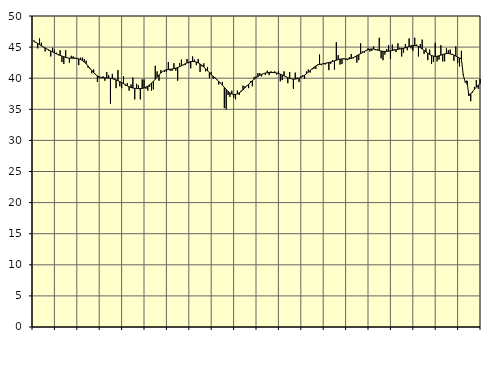
| Category | Piggar | Series 1 |
|---|---|---|
| nan | 46.1 | 45.91 |
| 1.0 | 45.8 | 45.76 |
| 1.0 | 44.8 | 45.59 |
| 1.0 | 46.4 | 45.4 |
| 1.0 | 45.7 | 45.22 |
| 1.0 | 45 | 45.03 |
| 1.0 | 44.3 | 44.86 |
| 1.0 | 44.7 | 44.69 |
| 1.0 | 44.4 | 44.53 |
| 1.0 | 43.5 | 44.37 |
| 1.0 | 44.9 | 44.22 |
| 1.0 | 44.6 | 44.07 |
| nan | 44.1 | 43.93 |
| 2.0 | 43.7 | 43.8 |
| 2.0 | 44.5 | 43.67 |
| 2.0 | 42.6 | 43.56 |
| 2.0 | 42.3 | 43.45 |
| 2.0 | 44.5 | 43.35 |
| 2.0 | 43.3 | 43.27 |
| 2.0 | 42.5 | 43.23 |
| 2.0 | 43.6 | 43.21 |
| 2.0 | 43.5 | 43.21 |
| 2.0 | 43.3 | 43.21 |
| 2.0 | 43.1 | 43.18 |
| nan | 42.1 | 43.11 |
| 3.0 | 43.3 | 43 |
| 3.0 | 43.3 | 42.83 |
| 3.0 | 43.1 | 42.59 |
| 3.0 | 42.8 | 42.31 |
| 3.0 | 41.7 | 41.97 |
| 3.0 | 41.5 | 41.6 |
| 3.0 | 40.8 | 41.24 |
| 3.0 | 41.4 | 40.9 |
| 3.0 | 40.7 | 40.6 |
| 3.0 | 39.4 | 40.37 |
| 3.0 | 40 | 40.21 |
| nan | 40 | 40.11 |
| 4.0 | 40.3 | 40.07 |
| 4.0 | 39.6 | 40.05 |
| 4.0 | 41 | 40.04 |
| 4.0 | 40.5 | 40.02 |
| 4.0 | 35.9 | 39.98 |
| 4.0 | 40.7 | 39.92 |
| 4.0 | 40 | 39.84 |
| 4.0 | 38.4 | 39.73 |
| 4.0 | 41.3 | 39.6 |
| 4.0 | 38.7 | 39.46 |
| 4.0 | 38.4 | 39.3 |
| nan | 40.3 | 39.13 |
| 5.0 | 38.8 | 38.95 |
| 5.0 | 39.2 | 38.77 |
| 5.0 | 38 | 38.62 |
| 5.0 | 39 | 38.5 |
| 5.0 | 40.1 | 38.42 |
| 5.0 | 36.6 | 38.37 |
| 5.0 | 39.1 | 38.34 |
| 5.0 | 38.9 | 38.32 |
| 5.0 | 36.6 | 38.33 |
| 5.0 | 39.8 | 38.36 |
| 5.0 | 39.8 | 38.44 |
| nan | 38.3 | 38.57 |
| 6.0 | 38 | 38.73 |
| 6.0 | 38.6 | 38.94 |
| 6.0 | 38 | 39.2 |
| 6.0 | 38.2 | 39.5 |
| 6.0 | 42 | 39.82 |
| 6.0 | 41.1 | 40.18 |
| 6.0 | 39.6 | 40.53 |
| 6.0 | 41.3 | 40.84 |
| 6.0 | 41.1 | 41.09 |
| 6.0 | 41 | 41.27 |
| 6.0 | 41 | 41.37 |
| nan | 42.6 | 41.41 |
| 7.0 | 41.2 | 41.44 |
| 7.0 | 41.2 | 41.48 |
| 7.0 | 42.4 | 41.54 |
| 7.0 | 41.2 | 41.62 |
| 7.0 | 39.6 | 41.73 |
| 7.0 | 42.4 | 41.85 |
| 7.0 | 43 | 41.99 |
| 7.0 | 42.1 | 42.15 |
| 7.0 | 42.1 | 42.31 |
| 7.0 | 43.1 | 42.46 |
| 7.0 | 42.4 | 42.59 |
| nan | 41.6 | 42.67 |
| 8.0 | 43.5 | 42.69 |
| 8.0 | 43 | 42.67 |
| 8.0 | 42.1 | 42.59 |
| 8.0 | 43.1 | 42.46 |
| 8.0 | 41 | 42.28 |
| 8.0 | 41.9 | 42.07 |
| 8.0 | 42.4 | 41.8 |
| 8.0 | 41.1 | 41.5 |
| 8.0 | 41.8 | 41.19 |
| 8.0 | 40 | 40.89 |
| 8.0 | 41 | 40.59 |
| nan | 39.9 | 40.31 |
| 9.0 | 40.1 | 40.04 |
| 9.0 | 39.7 | 39.77 |
| 9.0 | 39 | 39.49 |
| 9.0 | 39.3 | 39.19 |
| 9.0 | 39.4 | 38.86 |
| 9.0 | 35.2 | 38.53 |
| 9.0 | 35 | 38.19 |
| 9.0 | 37.3 | 37.88 |
| 9.0 | 37 | 37.63 |
| 9.0 | 38 | 37.46 |
| 9.0 | 36.8 | 37.37 |
| nan | 36.6 | 37.38 |
| 10.0 | 38 | 37.48 |
| 10.0 | 37.3 | 37.64 |
| 10.0 | 38 | 37.87 |
| 10.0 | 38.8 | 38.14 |
| 10.0 | 38.7 | 38.43 |
| 10.0 | 38.8 | 38.73 |
| 10.0 | 38.4 | 39.03 |
| 10.0 | 39.5 | 39.32 |
| 10.0 | 38.7 | 39.59 |
| 10.0 | 40.2 | 39.85 |
| 10.0 | 40.3 | 40.08 |
| nan | 40.8 | 40.29 |
| 11.0 | 40.8 | 40.47 |
| 11.0 | 40.3 | 40.62 |
| 11.0 | 40.7 | 40.74 |
| 11.0 | 40.5 | 40.83 |
| 11.0 | 41.2 | 40.88 |
| 11.0 | 40.5 | 40.91 |
| 11.0 | 41.1 | 40.92 |
| 11.0 | 41 | 40.91 |
| 11.0 | 41.1 | 40.89 |
| 11.0 | 40.6 | 40.84 |
| 11.0 | 41.1 | 40.76 |
| nan | 39.5 | 40.65 |
| 12.0 | 39.7 | 40.51 |
| 12.0 | 41.1 | 40.37 |
| 12.0 | 40.3 | 40.23 |
| 12.0 | 39.2 | 40.09 |
| 12.0 | 41 | 39.98 |
| 12.0 | 39.9 | 39.9 |
| 12.0 | 38.3 | 39.86 |
| 12.0 | 40.9 | 39.86 |
| 12.0 | 40.1 | 39.92 |
| 12.0 | 39.4 | 40 |
| 12.0 | 40.3 | 40.13 |
| nan | 40.5 | 40.29 |
| 13.0 | 39.9 | 40.49 |
| 13.0 | 41.1 | 40.72 |
| 13.0 | 41.4 | 40.97 |
| 13.0 | 40.9 | 41.24 |
| 13.0 | 41.4 | 41.51 |
| 13.0 | 41.5 | 41.75 |
| 13.0 | 41.5 | 41.96 |
| 13.0 | 42.2 | 42.11 |
| 13.0 | 43.8 | 42.2 |
| 13.0 | 42.1 | 42.27 |
| 13.0 | 42.4 | 42.33 |
| nan | 42.2 | 42.38 |
| 14.0 | 42.5 | 42.44 |
| 14.0 | 41.3 | 42.52 |
| 14.0 | 42.3 | 42.6 |
| 14.0 | 42.9 | 42.69 |
| 14.0 | 41.4 | 42.79 |
| 14.0 | 45.8 | 42.89 |
| 14.0 | 43.7 | 42.99 |
| 14.0 | 42.2 | 43.06 |
| 14.0 | 42.3 | 43.1 |
| 14.0 | 43.2 | 43.1 |
| 14.0 | 42.9 | 43.09 |
| nan | 42.9 | 43.09 |
| 15.0 | 43.4 | 43.11 |
| 15.0 | 43.9 | 43.18 |
| 15.0 | 43.2 | 43.3 |
| 15.0 | 43.4 | 43.45 |
| 15.0 | 42.5 | 43.62 |
| 15.0 | 42.9 | 43.79 |
| 15.0 | 45.6 | 43.95 |
| 15.0 | 44.3 | 44.12 |
| 15.0 | 44.1 | 44.3 |
| 15.0 | 44.4 | 44.46 |
| 15.0 | 44.8 | 44.59 |
| nan | 44.3 | 44.67 |
| 16.0 | 44.4 | 44.7 |
| 16.0 | 45.1 | 44.68 |
| 16.0 | 44.5 | 44.61 |
| 16.0 | 44.7 | 44.53 |
| 16.0 | 46.5 | 44.44 |
| 16.0 | 43.2 | 44.37 |
| 16.0 | 42.9 | 44.32 |
| 16.0 | 43.8 | 44.3 |
| 16.0 | 44.7 | 44.31 |
| 16.0 | 45.3 | 44.34 |
| 16.0 | 43.1 | 44.38 |
| nan | 45.4 | 44.45 |
| 17.0 | 44.7 | 44.52 |
| 17.0 | 44.2 | 44.58 |
| 17.0 | 45.6 | 44.64 |
| 17.0 | 44.9 | 44.71 |
| 17.0 | 43.5 | 44.76 |
| 17.0 | 44.1 | 44.82 |
| 17.0 | 45.5 | 44.9 |
| 17.0 | 44.5 | 45 |
| 17.0 | 46.4 | 45.1 |
| 17.0 | 44.8 | 45.19 |
| 17.0 | 44.4 | 45.25 |
| nan | 46.5 | 45.27 |
| 18.0 | 45.4 | 45.22 |
| 18.0 | 43.5 | 45.11 |
| 18.0 | 45.5 | 44.93 |
| 18.0 | 46.2 | 44.7 |
| 18.0 | 43.9 | 44.46 |
| 18.0 | 44.8 | 44.23 |
| 18.0 | 42.9 | 44.01 |
| 18.0 | 44.6 | 43.81 |
| 18.0 | 42.3 | 43.65 |
| 18.0 | 42.6 | 43.55 |
| 18.0 | 45.7 | 43.51 |
| nan | 42.7 | 43.53 |
| 19.0 | 43 | 43.6 |
| 19.0 | 45.3 | 43.71 |
| 19.0 | 42.7 | 43.82 |
| 19.0 | 42.7 | 43.91 |
| 19.0 | 44.8 | 43.96 |
| 19.0 | 44.5 | 43.96 |
| 19.0 | 44.6 | 43.92 |
| 19.0 | 43.9 | 43.83 |
| 19.0 | 42.8 | 43.71 |
| 19.0 | 45.1 | 43.56 |
| 19.0 | 42.4 | 43.4 |
| nan | 41.9 | 43.24 |
| 20.0 | 44.4 | 43.13 |
| 20.0 | 40.6 | 40.49 |
| 20.0 | 39.3 | 39.41 |
| 20.0 | 39 | 39.57 |
| 20.0 | 37.5 | 37.19 |
| 20.0 | 36.3 | 37.5 |
| 20.0 | 37.7 | 37.86 |
| 20.0 | 38.6 | 38.22 |
| 20.0 | 39.7 | 38.57 |
| 20.0 | 38.3 | 38.88 |
| 20.0 | 39.9 | 39.14 |